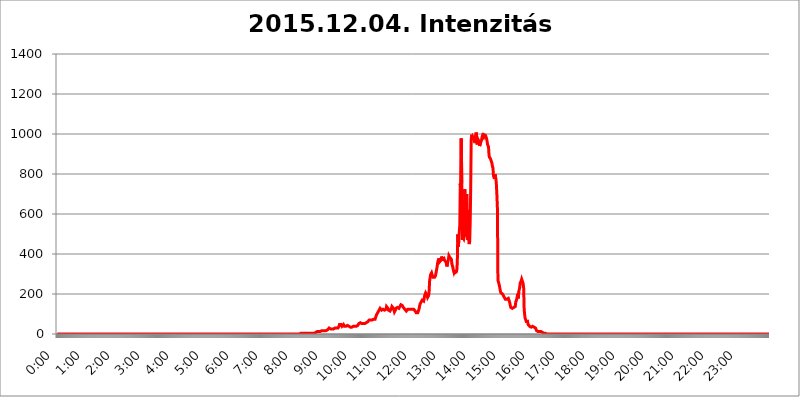
| Category | 2015.12.04. Intenzitás [W/m^2] |
|---|---|
| 0.0 | 0 |
| 0.0006944444444444445 | 0 |
| 0.001388888888888889 | 0 |
| 0.0020833333333333333 | 0 |
| 0.002777777777777778 | 0 |
| 0.003472222222222222 | 0 |
| 0.004166666666666667 | 0 |
| 0.004861111111111111 | 0 |
| 0.005555555555555556 | 0 |
| 0.0062499999999999995 | 0 |
| 0.006944444444444444 | 0 |
| 0.007638888888888889 | 0 |
| 0.008333333333333333 | 0 |
| 0.009027777777777779 | 0 |
| 0.009722222222222222 | 0 |
| 0.010416666666666666 | 0 |
| 0.011111111111111112 | 0 |
| 0.011805555555555555 | 0 |
| 0.012499999999999999 | 0 |
| 0.013194444444444444 | 0 |
| 0.013888888888888888 | 0 |
| 0.014583333333333332 | 0 |
| 0.015277777777777777 | 0 |
| 0.015972222222222224 | 0 |
| 0.016666666666666666 | 0 |
| 0.017361111111111112 | 0 |
| 0.018055555555555557 | 0 |
| 0.01875 | 0 |
| 0.019444444444444445 | 0 |
| 0.02013888888888889 | 0 |
| 0.020833333333333332 | 0 |
| 0.02152777777777778 | 0 |
| 0.022222222222222223 | 0 |
| 0.02291666666666667 | 0 |
| 0.02361111111111111 | 0 |
| 0.024305555555555556 | 0 |
| 0.024999999999999998 | 0 |
| 0.025694444444444447 | 0 |
| 0.02638888888888889 | 0 |
| 0.027083333333333334 | 0 |
| 0.027777777777777776 | 0 |
| 0.02847222222222222 | 0 |
| 0.029166666666666664 | 0 |
| 0.029861111111111113 | 0 |
| 0.030555555555555555 | 0 |
| 0.03125 | 0 |
| 0.03194444444444445 | 0 |
| 0.03263888888888889 | 0 |
| 0.03333333333333333 | 0 |
| 0.034027777777777775 | 0 |
| 0.034722222222222224 | 0 |
| 0.035416666666666666 | 0 |
| 0.036111111111111115 | 0 |
| 0.03680555555555556 | 0 |
| 0.0375 | 0 |
| 0.03819444444444444 | 0 |
| 0.03888888888888889 | 0 |
| 0.03958333333333333 | 0 |
| 0.04027777777777778 | 0 |
| 0.04097222222222222 | 0 |
| 0.041666666666666664 | 0 |
| 0.042361111111111106 | 0 |
| 0.04305555555555556 | 0 |
| 0.043750000000000004 | 0 |
| 0.044444444444444446 | 0 |
| 0.04513888888888889 | 0 |
| 0.04583333333333334 | 0 |
| 0.04652777777777778 | 0 |
| 0.04722222222222222 | 0 |
| 0.04791666666666666 | 0 |
| 0.04861111111111111 | 0 |
| 0.049305555555555554 | 0 |
| 0.049999999999999996 | 0 |
| 0.05069444444444445 | 0 |
| 0.051388888888888894 | 0 |
| 0.052083333333333336 | 0 |
| 0.05277777777777778 | 0 |
| 0.05347222222222222 | 0 |
| 0.05416666666666667 | 0 |
| 0.05486111111111111 | 0 |
| 0.05555555555555555 | 0 |
| 0.05625 | 0 |
| 0.05694444444444444 | 0 |
| 0.057638888888888885 | 0 |
| 0.05833333333333333 | 0 |
| 0.05902777777777778 | 0 |
| 0.059722222222222225 | 0 |
| 0.06041666666666667 | 0 |
| 0.061111111111111116 | 0 |
| 0.06180555555555556 | 0 |
| 0.0625 | 0 |
| 0.06319444444444444 | 0 |
| 0.06388888888888888 | 0 |
| 0.06458333333333334 | 0 |
| 0.06527777777777778 | 0 |
| 0.06597222222222222 | 0 |
| 0.06666666666666667 | 0 |
| 0.06736111111111111 | 0 |
| 0.06805555555555555 | 0 |
| 0.06874999999999999 | 0 |
| 0.06944444444444443 | 0 |
| 0.07013888888888889 | 0 |
| 0.07083333333333333 | 0 |
| 0.07152777777777779 | 0 |
| 0.07222222222222223 | 0 |
| 0.07291666666666667 | 0 |
| 0.07361111111111111 | 0 |
| 0.07430555555555556 | 0 |
| 0.075 | 0 |
| 0.07569444444444444 | 0 |
| 0.0763888888888889 | 0 |
| 0.07708333333333334 | 0 |
| 0.07777777777777778 | 0 |
| 0.07847222222222222 | 0 |
| 0.07916666666666666 | 0 |
| 0.0798611111111111 | 0 |
| 0.08055555555555556 | 0 |
| 0.08125 | 0 |
| 0.08194444444444444 | 0 |
| 0.08263888888888889 | 0 |
| 0.08333333333333333 | 0 |
| 0.08402777777777777 | 0 |
| 0.08472222222222221 | 0 |
| 0.08541666666666665 | 0 |
| 0.08611111111111112 | 0 |
| 0.08680555555555557 | 0 |
| 0.08750000000000001 | 0 |
| 0.08819444444444445 | 0 |
| 0.08888888888888889 | 0 |
| 0.08958333333333333 | 0 |
| 0.09027777777777778 | 0 |
| 0.09097222222222222 | 0 |
| 0.09166666666666667 | 0 |
| 0.09236111111111112 | 0 |
| 0.09305555555555556 | 0 |
| 0.09375 | 0 |
| 0.09444444444444444 | 0 |
| 0.09513888888888888 | 0 |
| 0.09583333333333333 | 0 |
| 0.09652777777777777 | 0 |
| 0.09722222222222222 | 0 |
| 0.09791666666666667 | 0 |
| 0.09861111111111111 | 0 |
| 0.09930555555555555 | 0 |
| 0.09999999999999999 | 0 |
| 0.10069444444444443 | 0 |
| 0.1013888888888889 | 0 |
| 0.10208333333333335 | 0 |
| 0.10277777777777779 | 0 |
| 0.10347222222222223 | 0 |
| 0.10416666666666667 | 0 |
| 0.10486111111111111 | 0 |
| 0.10555555555555556 | 0 |
| 0.10625 | 0 |
| 0.10694444444444444 | 0 |
| 0.1076388888888889 | 0 |
| 0.10833333333333334 | 0 |
| 0.10902777777777778 | 0 |
| 0.10972222222222222 | 0 |
| 0.1111111111111111 | 0 |
| 0.11180555555555556 | 0 |
| 0.11180555555555556 | 0 |
| 0.1125 | 0 |
| 0.11319444444444444 | 0 |
| 0.11388888888888889 | 0 |
| 0.11458333333333333 | 0 |
| 0.11527777777777777 | 0 |
| 0.11597222222222221 | 0 |
| 0.11666666666666665 | 0 |
| 0.1173611111111111 | 0 |
| 0.11805555555555557 | 0 |
| 0.11944444444444445 | 0 |
| 0.12013888888888889 | 0 |
| 0.12083333333333333 | 0 |
| 0.12152777777777778 | 0 |
| 0.12222222222222223 | 0 |
| 0.12291666666666667 | 0 |
| 0.12291666666666667 | 0 |
| 0.12361111111111112 | 0 |
| 0.12430555555555556 | 0 |
| 0.125 | 0 |
| 0.12569444444444444 | 0 |
| 0.12638888888888888 | 0 |
| 0.12708333333333333 | 0 |
| 0.16875 | 0 |
| 0.12847222222222224 | 0 |
| 0.12916666666666668 | 0 |
| 0.12986111111111112 | 0 |
| 0.13055555555555556 | 0 |
| 0.13125 | 0 |
| 0.13194444444444445 | 0 |
| 0.1326388888888889 | 0 |
| 0.13333333333333333 | 0 |
| 0.13402777777777777 | 0 |
| 0.13402777777777777 | 0 |
| 0.13472222222222222 | 0 |
| 0.13541666666666666 | 0 |
| 0.1361111111111111 | 0 |
| 0.13749999999999998 | 0 |
| 0.13819444444444443 | 0 |
| 0.1388888888888889 | 0 |
| 0.13958333333333334 | 0 |
| 0.14027777777777778 | 0 |
| 0.14097222222222222 | 0 |
| 0.14166666666666666 | 0 |
| 0.1423611111111111 | 0 |
| 0.14305555555555557 | 0 |
| 0.14375000000000002 | 0 |
| 0.14444444444444446 | 0 |
| 0.1451388888888889 | 0 |
| 0.1451388888888889 | 0 |
| 0.14652777777777778 | 0 |
| 0.14722222222222223 | 0 |
| 0.14791666666666667 | 0 |
| 0.1486111111111111 | 0 |
| 0.14930555555555555 | 0 |
| 0.15 | 0 |
| 0.15069444444444444 | 0 |
| 0.15138888888888888 | 0 |
| 0.15208333333333332 | 0 |
| 0.15277777777777776 | 0 |
| 0.15347222222222223 | 0 |
| 0.15416666666666667 | 0 |
| 0.15486111111111112 | 0 |
| 0.15555555555555556 | 0 |
| 0.15625 | 0 |
| 0.15694444444444444 | 0 |
| 0.15763888888888888 | 0 |
| 0.15833333333333333 | 0 |
| 0.15902777777777777 | 0 |
| 0.15972222222222224 | 0 |
| 0.16041666666666668 | 0 |
| 0.16111111111111112 | 0 |
| 0.16180555555555556 | 0 |
| 0.1625 | 0 |
| 0.16319444444444445 | 0 |
| 0.1638888888888889 | 0 |
| 0.16458333333333333 | 0 |
| 0.16527777777777777 | 0 |
| 0.16597222222222222 | 0 |
| 0.16666666666666666 | 0 |
| 0.1673611111111111 | 0 |
| 0.16805555555555554 | 0 |
| 0.16874999999999998 | 0 |
| 0.16944444444444443 | 0 |
| 0.17013888888888887 | 0 |
| 0.1708333333333333 | 0 |
| 0.17152777777777775 | 0 |
| 0.17222222222222225 | 0 |
| 0.1729166666666667 | 0 |
| 0.17361111111111113 | 0 |
| 0.17430555555555557 | 0 |
| 0.17500000000000002 | 0 |
| 0.17569444444444446 | 0 |
| 0.1763888888888889 | 0 |
| 0.17708333333333334 | 0 |
| 0.17777777777777778 | 0 |
| 0.17847222222222223 | 0 |
| 0.17916666666666667 | 0 |
| 0.1798611111111111 | 0 |
| 0.18055555555555555 | 0 |
| 0.18125 | 0 |
| 0.18194444444444444 | 0 |
| 0.1826388888888889 | 0 |
| 0.18333333333333335 | 0 |
| 0.1840277777777778 | 0 |
| 0.18472222222222223 | 0 |
| 0.18541666666666667 | 0 |
| 0.18611111111111112 | 0 |
| 0.18680555555555556 | 0 |
| 0.1875 | 0 |
| 0.18819444444444444 | 0 |
| 0.18888888888888888 | 0 |
| 0.18958333333333333 | 0 |
| 0.19027777777777777 | 0 |
| 0.1909722222222222 | 0 |
| 0.19166666666666665 | 0 |
| 0.19236111111111112 | 0 |
| 0.19305555555555554 | 0 |
| 0.19375 | 0 |
| 0.19444444444444445 | 0 |
| 0.1951388888888889 | 0 |
| 0.19583333333333333 | 0 |
| 0.19652777777777777 | 0 |
| 0.19722222222222222 | 0 |
| 0.19791666666666666 | 0 |
| 0.1986111111111111 | 0 |
| 0.19930555555555554 | 0 |
| 0.19999999999999998 | 0 |
| 0.20069444444444443 | 0 |
| 0.20138888888888887 | 0 |
| 0.2020833333333333 | 0 |
| 0.2027777777777778 | 0 |
| 0.2034722222222222 | 0 |
| 0.2041666666666667 | 0 |
| 0.20486111111111113 | 0 |
| 0.20555555555555557 | 0 |
| 0.20625000000000002 | 0 |
| 0.20694444444444446 | 0 |
| 0.2076388888888889 | 0 |
| 0.20833333333333334 | 0 |
| 0.20902777777777778 | 0 |
| 0.20972222222222223 | 0 |
| 0.21041666666666667 | 0 |
| 0.2111111111111111 | 0 |
| 0.21180555555555555 | 0 |
| 0.2125 | 0 |
| 0.21319444444444444 | 0 |
| 0.2138888888888889 | 0 |
| 0.21458333333333335 | 0 |
| 0.2152777777777778 | 0 |
| 0.21597222222222223 | 0 |
| 0.21666666666666667 | 0 |
| 0.21736111111111112 | 0 |
| 0.21805555555555556 | 0 |
| 0.21875 | 0 |
| 0.21944444444444444 | 0 |
| 0.22013888888888888 | 0 |
| 0.22083333333333333 | 0 |
| 0.22152777777777777 | 0 |
| 0.2222222222222222 | 0 |
| 0.22291666666666665 | 0 |
| 0.2236111111111111 | 0 |
| 0.22430555555555556 | 0 |
| 0.225 | 0 |
| 0.22569444444444445 | 0 |
| 0.2263888888888889 | 0 |
| 0.22708333333333333 | 0 |
| 0.22777777777777777 | 0 |
| 0.22847222222222222 | 0 |
| 0.22916666666666666 | 0 |
| 0.2298611111111111 | 0 |
| 0.23055555555555554 | 0 |
| 0.23124999999999998 | 0 |
| 0.23194444444444443 | 0 |
| 0.23263888888888887 | 0 |
| 0.2333333333333333 | 0 |
| 0.2340277777777778 | 0 |
| 0.2347222222222222 | 0 |
| 0.2354166666666667 | 0 |
| 0.23611111111111113 | 0 |
| 0.23680555555555557 | 0 |
| 0.23750000000000002 | 0 |
| 0.23819444444444446 | 0 |
| 0.2388888888888889 | 0 |
| 0.23958333333333334 | 0 |
| 0.24027777777777778 | 0 |
| 0.24097222222222223 | 0 |
| 0.24166666666666667 | 0 |
| 0.2423611111111111 | 0 |
| 0.24305555555555555 | 0 |
| 0.24375 | 0 |
| 0.24444444444444446 | 0 |
| 0.24513888888888888 | 0 |
| 0.24583333333333335 | 0 |
| 0.2465277777777778 | 0 |
| 0.24722222222222223 | 0 |
| 0.24791666666666667 | 0 |
| 0.24861111111111112 | 0 |
| 0.24930555555555556 | 0 |
| 0.25 | 0 |
| 0.25069444444444444 | 0 |
| 0.2513888888888889 | 0 |
| 0.2520833333333333 | 0 |
| 0.25277777777777777 | 0 |
| 0.2534722222222222 | 0 |
| 0.25416666666666665 | 0 |
| 0.2548611111111111 | 0 |
| 0.2555555555555556 | 0 |
| 0.25625000000000003 | 0 |
| 0.2569444444444445 | 0 |
| 0.2576388888888889 | 0 |
| 0.25833333333333336 | 0 |
| 0.2590277777777778 | 0 |
| 0.25972222222222224 | 0 |
| 0.2604166666666667 | 0 |
| 0.2611111111111111 | 0 |
| 0.26180555555555557 | 0 |
| 0.2625 | 0 |
| 0.26319444444444445 | 0 |
| 0.2638888888888889 | 0 |
| 0.26458333333333334 | 0 |
| 0.2652777777777778 | 0 |
| 0.2659722222222222 | 0 |
| 0.26666666666666666 | 0 |
| 0.2673611111111111 | 0 |
| 0.26805555555555555 | 0 |
| 0.26875 | 0 |
| 0.26944444444444443 | 0 |
| 0.2701388888888889 | 0 |
| 0.2708333333333333 | 0 |
| 0.27152777777777776 | 0 |
| 0.2722222222222222 | 0 |
| 0.27291666666666664 | 0 |
| 0.2736111111111111 | 0 |
| 0.2743055555555555 | 0 |
| 0.27499999999999997 | 0 |
| 0.27569444444444446 | 0 |
| 0.27638888888888885 | 0 |
| 0.27708333333333335 | 0 |
| 0.2777777777777778 | 0 |
| 0.27847222222222223 | 0 |
| 0.2791666666666667 | 0 |
| 0.2798611111111111 | 0 |
| 0.28055555555555556 | 0 |
| 0.28125 | 0 |
| 0.28194444444444444 | 0 |
| 0.2826388888888889 | 0 |
| 0.2833333333333333 | 0 |
| 0.28402777777777777 | 0 |
| 0.2847222222222222 | 0 |
| 0.28541666666666665 | 0 |
| 0.28611111111111115 | 0 |
| 0.28680555555555554 | 0 |
| 0.28750000000000003 | 0 |
| 0.2881944444444445 | 0 |
| 0.2888888888888889 | 0 |
| 0.28958333333333336 | 0 |
| 0.2902777777777778 | 0 |
| 0.29097222222222224 | 0 |
| 0.2916666666666667 | 0 |
| 0.2923611111111111 | 0 |
| 0.29305555555555557 | 0 |
| 0.29375 | 0 |
| 0.29444444444444445 | 0 |
| 0.2951388888888889 | 0 |
| 0.29583333333333334 | 0 |
| 0.2965277777777778 | 0 |
| 0.2972222222222222 | 0 |
| 0.29791666666666666 | 0 |
| 0.2986111111111111 | 0 |
| 0.29930555555555555 | 0 |
| 0.3 | 0 |
| 0.30069444444444443 | 0 |
| 0.3013888888888889 | 0 |
| 0.3020833333333333 | 0 |
| 0.30277777777777776 | 0 |
| 0.3034722222222222 | 0 |
| 0.30416666666666664 | 0 |
| 0.3048611111111111 | 0 |
| 0.3055555555555555 | 0 |
| 0.30624999999999997 | 0 |
| 0.3069444444444444 | 0 |
| 0.3076388888888889 | 0 |
| 0.30833333333333335 | 0 |
| 0.3090277777777778 | 0 |
| 0.30972222222222223 | 0 |
| 0.3104166666666667 | 0 |
| 0.3111111111111111 | 0 |
| 0.31180555555555556 | 0 |
| 0.3125 | 0 |
| 0.31319444444444444 | 0 |
| 0.3138888888888889 | 0 |
| 0.3145833333333333 | 0 |
| 0.31527777777777777 | 0 |
| 0.3159722222222222 | 0 |
| 0.31666666666666665 | 0 |
| 0.31736111111111115 | 0 |
| 0.31805555555555554 | 0 |
| 0.31875000000000003 | 0 |
| 0.3194444444444445 | 0 |
| 0.3201388888888889 | 0 |
| 0.32083333333333336 | 0 |
| 0.3215277777777778 | 0 |
| 0.32222222222222224 | 0 |
| 0.3229166666666667 | 0 |
| 0.3236111111111111 | 0 |
| 0.32430555555555557 | 0 |
| 0.325 | 0 |
| 0.32569444444444445 | 0 |
| 0.3263888888888889 | 0 |
| 0.32708333333333334 | 0 |
| 0.3277777777777778 | 0 |
| 0.3284722222222222 | 0 |
| 0.32916666666666666 | 0 |
| 0.3298611111111111 | 0 |
| 0.33055555555555555 | 0 |
| 0.33125 | 0 |
| 0.33194444444444443 | 0 |
| 0.3326388888888889 | 0 |
| 0.3333333333333333 | 0 |
| 0.3340277777777778 | 0 |
| 0.3347222222222222 | 0 |
| 0.3354166666666667 | 0 |
| 0.3361111111111111 | 0 |
| 0.3368055555555556 | 0 |
| 0.33749999999999997 | 0 |
| 0.33819444444444446 | 0 |
| 0.33888888888888885 | 0 |
| 0.33958333333333335 | 0 |
| 0.34027777777777773 | 3.525 |
| 0.34097222222222223 | 3.525 |
| 0.3416666666666666 | 3.525 |
| 0.3423611111111111 | 3.525 |
| 0.3430555555555555 | 3.525 |
| 0.34375 | 3.525 |
| 0.3444444444444445 | 3.525 |
| 0.3451388888888889 | 3.525 |
| 0.3458333333333334 | 3.525 |
| 0.34652777777777777 | 3.525 |
| 0.34722222222222227 | 3.525 |
| 0.34791666666666665 | 3.525 |
| 0.34861111111111115 | 3.525 |
| 0.34930555555555554 | 3.525 |
| 0.35000000000000003 | 3.525 |
| 0.3506944444444444 | 3.525 |
| 0.3513888888888889 | 3.525 |
| 0.3520833333333333 | 3.525 |
| 0.3527777777777778 | 3.525 |
| 0.3534722222222222 | 3.525 |
| 0.3541666666666667 | 3.525 |
| 0.3548611111111111 | 3.525 |
| 0.35555555555555557 | 3.525 |
| 0.35625 | 3.525 |
| 0.35694444444444445 | 3.525 |
| 0.3576388888888889 | 3.525 |
| 0.35833333333333334 | 3.525 |
| 0.3590277777777778 | 3.525 |
| 0.3597222222222222 | 3.525 |
| 0.36041666666666666 | 3.525 |
| 0.3611111111111111 | 3.525 |
| 0.36180555555555555 | 7.887 |
| 0.3625 | 7.887 |
| 0.36319444444444443 | 7.887 |
| 0.3638888888888889 | 12.257 |
| 0.3645833333333333 | 12.257 |
| 0.3652777777777778 | 12.257 |
| 0.3659722222222222 | 12.257 |
| 0.3666666666666667 | 12.257 |
| 0.3673611111111111 | 12.257 |
| 0.3680555555555556 | 12.257 |
| 0.36874999999999997 | 12.257 |
| 0.36944444444444446 | 12.257 |
| 0.37013888888888885 | 12.257 |
| 0.37083333333333335 | 16.636 |
| 0.37152777777777773 | 16.636 |
| 0.37222222222222223 | 16.636 |
| 0.3729166666666666 | 16.636 |
| 0.3736111111111111 | 16.636 |
| 0.3743055555555555 | 16.636 |
| 0.375 | 16.636 |
| 0.3756944444444445 | 16.636 |
| 0.3763888888888889 | 16.636 |
| 0.3770833333333334 | 16.636 |
| 0.37777777777777777 | 16.636 |
| 0.37847222222222227 | 16.636 |
| 0.37916666666666665 | 21.024 |
| 0.37986111111111115 | 21.024 |
| 0.38055555555555554 | 25.419 |
| 0.38125000000000003 | 29.823 |
| 0.3819444444444444 | 29.823 |
| 0.3826388888888889 | 29.823 |
| 0.3833333333333333 | 25.419 |
| 0.3840277777777778 | 25.419 |
| 0.3847222222222222 | 25.419 |
| 0.3854166666666667 | 25.419 |
| 0.3861111111111111 | 25.419 |
| 0.38680555555555557 | 25.419 |
| 0.3875 | 25.419 |
| 0.38819444444444445 | 25.419 |
| 0.3888888888888889 | 29.823 |
| 0.38958333333333334 | 29.823 |
| 0.3902777777777778 | 29.823 |
| 0.3909722222222222 | 29.823 |
| 0.39166666666666666 | 29.823 |
| 0.3923611111111111 | 29.823 |
| 0.39305555555555555 | 29.823 |
| 0.39375 | 29.823 |
| 0.39444444444444443 | 34.234 |
| 0.3951388888888889 | 38.653 |
| 0.3958333333333333 | 47.511 |
| 0.3965277777777778 | 47.511 |
| 0.3972222222222222 | 47.511 |
| 0.3979166666666667 | 47.511 |
| 0.3986111111111111 | 43.079 |
| 0.3993055555555556 | 38.653 |
| 0.39999999999999997 | 43.079 |
| 0.40069444444444446 | 43.079 |
| 0.40138888888888885 | 47.511 |
| 0.40208333333333335 | 43.079 |
| 0.40277777777777773 | 38.653 |
| 0.40347222222222223 | 38.653 |
| 0.4041666666666666 | 34.234 |
| 0.4048611111111111 | 38.653 |
| 0.4055555555555555 | 38.653 |
| 0.40625 | 38.653 |
| 0.4069444444444445 | 43.079 |
| 0.4076388888888889 | 43.079 |
| 0.4083333333333334 | 38.653 |
| 0.40902777777777777 | 38.653 |
| 0.40972222222222227 | 38.653 |
| 0.41041666666666665 | 38.653 |
| 0.41111111111111115 | 34.234 |
| 0.41180555555555554 | 34.234 |
| 0.41250000000000003 | 34.234 |
| 0.4131944444444444 | 34.234 |
| 0.4138888888888889 | 34.234 |
| 0.4145833333333333 | 34.234 |
| 0.4152777777777778 | 38.653 |
| 0.4159722222222222 | 38.653 |
| 0.4166666666666667 | 38.653 |
| 0.4173611111111111 | 38.653 |
| 0.41805555555555557 | 38.653 |
| 0.41875 | 38.653 |
| 0.41944444444444445 | 38.653 |
| 0.4201388888888889 | 38.653 |
| 0.42083333333333334 | 38.653 |
| 0.4215277777777778 | 43.079 |
| 0.4222222222222222 | 47.511 |
| 0.42291666666666666 | 51.951 |
| 0.4236111111111111 | 51.951 |
| 0.42430555555555555 | 51.951 |
| 0.425 | 56.398 |
| 0.42569444444444443 | 56.398 |
| 0.4263888888888889 | 56.398 |
| 0.4270833333333333 | 51.951 |
| 0.4277777777777778 | 51.951 |
| 0.4284722222222222 | 51.951 |
| 0.4291666666666667 | 51.951 |
| 0.4298611111111111 | 51.951 |
| 0.4305555555555556 | 51.951 |
| 0.43124999999999997 | 51.951 |
| 0.43194444444444446 | 51.951 |
| 0.43263888888888885 | 51.951 |
| 0.43333333333333335 | 56.398 |
| 0.43402777777777773 | 56.398 |
| 0.43472222222222223 | 60.85 |
| 0.4354166666666666 | 60.85 |
| 0.4361111111111111 | 65.31 |
| 0.4368055555555555 | 65.31 |
| 0.4375 | 69.775 |
| 0.4381944444444445 | 69.775 |
| 0.4388888888888889 | 69.775 |
| 0.4395833333333334 | 69.775 |
| 0.44027777777777777 | 69.775 |
| 0.44097222222222227 | 69.775 |
| 0.44166666666666665 | 69.775 |
| 0.44236111111111115 | 74.246 |
| 0.44305555555555554 | 74.246 |
| 0.44375000000000003 | 74.246 |
| 0.4444444444444444 | 74.246 |
| 0.4451388888888889 | 74.246 |
| 0.4458333333333333 | 74.246 |
| 0.4465277777777778 | 83.205 |
| 0.4472222222222222 | 87.692 |
| 0.4479166666666667 | 96.682 |
| 0.4486111111111111 | 101.184 |
| 0.44930555555555557 | 105.69 |
| 0.45 | 110.201 |
| 0.45069444444444445 | 110.201 |
| 0.4513888888888889 | 119.235 |
| 0.45208333333333334 | 123.758 |
| 0.4527777777777778 | 128.284 |
| 0.4534722222222222 | 128.284 |
| 0.45416666666666666 | 123.758 |
| 0.4548611111111111 | 119.235 |
| 0.45555555555555555 | 123.758 |
| 0.45625 | 123.758 |
| 0.45694444444444443 | 123.758 |
| 0.4576388888888889 | 119.235 |
| 0.4583333333333333 | 119.235 |
| 0.4590277777777778 | 119.235 |
| 0.4597222222222222 | 119.235 |
| 0.4604166666666667 | 119.235 |
| 0.4611111111111111 | 123.758 |
| 0.4618055555555556 | 137.347 |
| 0.46249999999999997 | 137.347 |
| 0.46319444444444446 | 132.814 |
| 0.46388888888888885 | 128.284 |
| 0.46458333333333335 | 119.235 |
| 0.46527777777777773 | 114.716 |
| 0.46597222222222223 | 114.716 |
| 0.4666666666666666 | 114.716 |
| 0.4673611111111111 | 114.716 |
| 0.4680555555555555 | 119.235 |
| 0.46875 | 128.284 |
| 0.4694444444444445 | 137.347 |
| 0.4701388888888889 | 137.347 |
| 0.4708333333333334 | 137.347 |
| 0.47152777777777777 | 128.284 |
| 0.47222222222222227 | 119.235 |
| 0.47291666666666665 | 110.201 |
| 0.47361111111111115 | 110.201 |
| 0.47430555555555554 | 119.235 |
| 0.47500000000000003 | 128.284 |
| 0.4756944444444444 | 128.284 |
| 0.4763888888888889 | 132.814 |
| 0.4770833333333333 | 132.814 |
| 0.4777777777777778 | 132.814 |
| 0.4784722222222222 | 128.284 |
| 0.4791666666666667 | 128.284 |
| 0.4798611111111111 | 128.284 |
| 0.48055555555555557 | 137.347 |
| 0.48125 | 141.884 |
| 0.48194444444444445 | 146.423 |
| 0.4826388888888889 | 146.423 |
| 0.48333333333333334 | 141.884 |
| 0.4840277777777778 | 141.884 |
| 0.4847222222222222 | 137.347 |
| 0.48541666666666666 | 132.814 |
| 0.4861111111111111 | 128.284 |
| 0.48680555555555555 | 128.284 |
| 0.4875 | 123.758 |
| 0.48819444444444443 | 123.758 |
| 0.4888888888888889 | 119.235 |
| 0.4895833333333333 | 114.716 |
| 0.4902777777777778 | 119.235 |
| 0.4909722222222222 | 119.235 |
| 0.4916666666666667 | 123.758 |
| 0.4923611111111111 | 123.758 |
| 0.4930555555555556 | 123.758 |
| 0.49374999999999997 | 123.758 |
| 0.49444444444444446 | 123.758 |
| 0.49513888888888885 | 123.758 |
| 0.49583333333333335 | 123.758 |
| 0.49652777777777773 | 119.235 |
| 0.49722222222222223 | 119.235 |
| 0.4979166666666666 | 123.758 |
| 0.4986111111111111 | 123.758 |
| 0.4993055555555555 | 123.758 |
| 0.5 | 123.758 |
| 0.5006944444444444 | 119.235 |
| 0.5013888888888889 | 119.235 |
| 0.5020833333333333 | 114.716 |
| 0.5027777777777778 | 110.201 |
| 0.5034722222222222 | 105.69 |
| 0.5041666666666667 | 110.201 |
| 0.5048611111111111 | 105.69 |
| 0.5055555555555555 | 105.69 |
| 0.50625 | 110.201 |
| 0.5069444444444444 | 119.235 |
| 0.5076388888888889 | 128.284 |
| 0.5083333333333333 | 141.884 |
| 0.5090277777777777 | 150.964 |
| 0.5097222222222222 | 155.509 |
| 0.5104166666666666 | 160.056 |
| 0.5111111111111112 | 164.605 |
| 0.5118055555555555 | 169.156 |
| 0.5125000000000001 | 164.605 |
| 0.5131944444444444 | 164.605 |
| 0.513888888888889 | 164.605 |
| 0.5145833333333333 | 178.264 |
| 0.5152777777777778 | 191.937 |
| 0.5159722222222222 | 196.497 |
| 0.5166666666666667 | 205.62 |
| 0.517361111111111 | 205.62 |
| 0.5180555555555556 | 201.058 |
| 0.5187499999999999 | 191.937 |
| 0.5194444444444445 | 182.82 |
| 0.5201388888888888 | 178.264 |
| 0.5208333333333334 | 191.937 |
| 0.5215277777777778 | 210.182 |
| 0.5222222222222223 | 264.932 |
| 0.5229166666666667 | 269.49 |
| 0.5236111111111111 | 296.808 |
| 0.5243055555555556 | 301.354 |
| 0.525 | 305.898 |
| 0.5256944444444445 | 296.808 |
| 0.5263888888888889 | 292.259 |
| 0.5270833333333333 | 283.156 |
| 0.5277777777777778 | 278.603 |
| 0.5284722222222222 | 283.156 |
| 0.5291666666666667 | 283.156 |
| 0.5298611111111111 | 278.603 |
| 0.5305555555555556 | 292.259 |
| 0.53125 | 305.898 |
| 0.5319444444444444 | 310.44 |
| 0.5326388888888889 | 333.113 |
| 0.5333333333333333 | 351.198 |
| 0.5340277777777778 | 364.728 |
| 0.5347222222222222 | 369.23 |
| 0.5354166666666667 | 378.224 |
| 0.5361111111111111 | 360.221 |
| 0.5368055555555555 | 360.221 |
| 0.5375 | 360.221 |
| 0.5381944444444444 | 369.23 |
| 0.5388888888888889 | 387.202 |
| 0.5395833333333333 | 387.202 |
| 0.5402777777777777 | 373.729 |
| 0.5409722222222222 | 373.729 |
| 0.5416666666666666 | 369.23 |
| 0.5423611111111112 | 378.224 |
| 0.5430555555555555 | 369.23 |
| 0.5437500000000001 | 364.728 |
| 0.5444444444444444 | 369.23 |
| 0.545138888888889 | 360.221 |
| 0.5458333333333333 | 351.198 |
| 0.5465277777777778 | 337.639 |
| 0.5472222222222222 | 351.198 |
| 0.5479166666666667 | 351.198 |
| 0.548611111111111 | 373.729 |
| 0.5493055555555556 | 391.685 |
| 0.5499999999999999 | 391.685 |
| 0.5506944444444445 | 382.715 |
| 0.5513888888888888 | 382.715 |
| 0.5520833333333334 | 378.224 |
| 0.5527777777777778 | 373.729 |
| 0.5534722222222223 | 351.198 |
| 0.5541666666666667 | 342.162 |
| 0.5548611111111111 | 333.113 |
| 0.5555555555555556 | 319.517 |
| 0.55625 | 310.44 |
| 0.5569444444444445 | 319.517 |
| 0.5576388888888889 | 305.898 |
| 0.5583333333333333 | 305.898 |
| 0.5590277777777778 | 310.44 |
| 0.5597222222222222 | 310.44 |
| 0.5604166666666667 | 319.517 |
| 0.5611111111111111 | 360.221 |
| 0.5618055555555556 | 497.836 |
| 0.5625 | 436.27 |
| 0.5631944444444444 | 467.187 |
| 0.5638888888888889 | 510.885 |
| 0.5645833333333333 | 545.416 |
| 0.5652777777777778 | 751.803 |
| 0.5659722222222222 | 707.8 |
| 0.5666666666666667 | 977.508 |
| 0.5673611111111111 | 751.803 |
| 0.5680555555555555 | 471.582 |
| 0.56875 | 484.735 |
| 0.5694444444444444 | 484.735 |
| 0.5701388888888889 | 475.972 |
| 0.5708333333333333 | 489.108 |
| 0.5715277777777777 | 723.889 |
| 0.5722222222222222 | 613.252 |
| 0.5729166666666666 | 484.735 |
| 0.5736111111111112 | 667.123 |
| 0.5743055555555555 | 699.717 |
| 0.5750000000000001 | 523.88 |
| 0.5756944444444444 | 471.582 |
| 0.576388888888889 | 617.436 |
| 0.5770833333333333 | 471.582 |
| 0.5777777777777778 | 449.551 |
| 0.5784722222222222 | 462.786 |
| 0.5791666666666667 | 558.261 |
| 0.579861111111111 | 723.889 |
| 0.5805555555555556 | 970.034 |
| 0.5812499999999999 | 996.182 |
| 0.5819444444444445 | 977.508 |
| 0.5826388888888888 | 984.98 |
| 0.5833333333333334 | 984.98 |
| 0.5840277777777778 | 988.714 |
| 0.5847222222222223 | 966.295 |
| 0.5854166666666667 | 962.555 |
| 0.5861111111111111 | 955.071 |
| 0.5868055555555556 | 992.448 |
| 0.5875 | 1007.383 |
| 0.5881944444444445 | 992.448 |
| 0.5888888888888889 | 947.58 |
| 0.5895833333333333 | 977.508 |
| 0.5902777777777778 | 981.244 |
| 0.5909722222222222 | 981.244 |
| 0.5916666666666667 | 962.555 |
| 0.5923611111111111 | 940.082 |
| 0.5930555555555556 | 940.082 |
| 0.59375 | 955.071 |
| 0.5944444444444444 | 962.555 |
| 0.5951388888888889 | 970.034 |
| 0.5958333333333333 | 984.98 |
| 0.5965277777777778 | 992.448 |
| 0.5972222222222222 | 996.182 |
| 0.5979166666666667 | 984.98 |
| 0.5986111111111111 | 996.182 |
| 0.5993055555555555 | 992.448 |
| 0.6 | 992.448 |
| 0.6006944444444444 | 992.448 |
| 0.6013888888888889 | 992.448 |
| 0.6020833333333333 | 977.508 |
| 0.6027777777777777 | 966.295 |
| 0.6034722222222222 | 947.58 |
| 0.6041666666666666 | 947.58 |
| 0.6048611111111112 | 936.33 |
| 0.6055555555555555 | 894.885 |
| 0.6062500000000001 | 883.516 |
| 0.6069444444444444 | 879.719 |
| 0.607638888888889 | 875.918 |
| 0.6083333333333333 | 868.305 |
| 0.6090277777777778 | 872.114 |
| 0.6097222222222222 | 853.029 |
| 0.6104166666666667 | 837.682 |
| 0.611111111111111 | 829.981 |
| 0.6118055555555556 | 791.169 |
| 0.6124999999999999 | 791.169 |
| 0.6131944444444445 | 775.492 |
| 0.6138888888888888 | 798.974 |
| 0.6145833333333334 | 783.342 |
| 0.6152777777777778 | 775.492 |
| 0.6159722222222223 | 743.859 |
| 0.6166666666666667 | 691.608 |
| 0.6173611111111111 | 625.784 |
| 0.6180555555555556 | 269.49 |
| 0.61875 | 260.373 |
| 0.6194444444444445 | 251.251 |
| 0.6201388888888889 | 242.127 |
| 0.6208333333333333 | 228.436 |
| 0.6215277777777778 | 214.746 |
| 0.6222222222222222 | 205.62 |
| 0.6229166666666667 | 201.058 |
| 0.6236111111111111 | 201.058 |
| 0.6243055555555556 | 201.058 |
| 0.625 | 201.058 |
| 0.6256944444444444 | 191.937 |
| 0.6263888888888889 | 187.378 |
| 0.6270833333333333 | 182.82 |
| 0.6277777777777778 | 182.82 |
| 0.6284722222222222 | 173.709 |
| 0.6291666666666667 | 173.709 |
| 0.6298611111111111 | 173.709 |
| 0.6305555555555555 | 173.709 |
| 0.63125 | 173.709 |
| 0.6319444444444444 | 178.264 |
| 0.6326388888888889 | 178.264 |
| 0.6333333333333333 | 173.709 |
| 0.6340277777777777 | 164.605 |
| 0.6347222222222222 | 155.509 |
| 0.6354166666666666 | 141.884 |
| 0.6361111111111112 | 132.814 |
| 0.6368055555555555 | 132.814 |
| 0.6375000000000001 | 132.814 |
| 0.6381944444444444 | 128.284 |
| 0.638888888888889 | 128.284 |
| 0.6395833333333333 | 128.284 |
| 0.6402777777777778 | 132.814 |
| 0.6409722222222222 | 137.347 |
| 0.6416666666666667 | 137.347 |
| 0.642361111111111 | 137.347 |
| 0.6430555555555556 | 160.056 |
| 0.6437499999999999 | 164.605 |
| 0.6444444444444445 | 173.709 |
| 0.6451388888888888 | 178.264 |
| 0.6458333333333334 | 201.058 |
| 0.6465277777777778 | 178.264 |
| 0.6472222222222223 | 210.182 |
| 0.6479166666666667 | 214.746 |
| 0.6486111111111111 | 233 |
| 0.6493055555555556 | 255.813 |
| 0.65 | 260.373 |
| 0.6506944444444445 | 264.932 |
| 0.6513888888888889 | 274.047 |
| 0.6520833333333333 | 274.047 |
| 0.6527777777777778 | 278.603 |
| 0.6534722222222222 | 251.251 |
| 0.6541666666666667 | 228.436 |
| 0.6548611111111111 | 123.758 |
| 0.6555555555555556 | 96.682 |
| 0.65625 | 78.722 |
| 0.6569444444444444 | 74.246 |
| 0.6576388888888889 | 65.31 |
| 0.6583333333333333 | 56.398 |
| 0.6590277777777778 | 69.775 |
| 0.6597222222222222 | 60.85 |
| 0.6604166666666667 | 47.511 |
| 0.6611111111111111 | 43.079 |
| 0.6618055555555555 | 47.511 |
| 0.6625 | 38.653 |
| 0.6631944444444444 | 38.653 |
| 0.6638888888888889 | 34.234 |
| 0.6645833333333333 | 34.234 |
| 0.6652777777777777 | 34.234 |
| 0.6659722222222222 | 38.653 |
| 0.6666666666666666 | 38.653 |
| 0.6673611111111111 | 38.653 |
| 0.6680555555555556 | 34.234 |
| 0.6687500000000001 | 34.234 |
| 0.6694444444444444 | 34.234 |
| 0.6701388888888888 | 29.823 |
| 0.6708333333333334 | 29.823 |
| 0.6715277777777778 | 25.419 |
| 0.6722222222222222 | 16.636 |
| 0.6729166666666666 | 16.636 |
| 0.6736111111111112 | 16.636 |
| 0.6743055555555556 | 12.257 |
| 0.6749999999999999 | 12.257 |
| 0.6756944444444444 | 12.257 |
| 0.6763888888888889 | 12.257 |
| 0.6770833333333334 | 12.257 |
| 0.6777777777777777 | 7.887 |
| 0.6784722222222223 | 12.257 |
| 0.6791666666666667 | 7.887 |
| 0.6798611111111111 | 7.887 |
| 0.6805555555555555 | 7.887 |
| 0.68125 | 7.887 |
| 0.6819444444444445 | 3.525 |
| 0.6826388888888889 | 3.525 |
| 0.6833333333333332 | 3.525 |
| 0.6840277777777778 | 3.525 |
| 0.6847222222222222 | 3.525 |
| 0.6854166666666667 | 3.525 |
| 0.686111111111111 | 3.525 |
| 0.6868055555555556 | 0 |
| 0.6875 | 0 |
| 0.6881944444444444 | 0 |
| 0.688888888888889 | 0 |
| 0.6895833333333333 | 0 |
| 0.6902777777777778 | 0 |
| 0.6909722222222222 | 0 |
| 0.6916666666666668 | 0 |
| 0.6923611111111111 | 0 |
| 0.6930555555555555 | 0 |
| 0.69375 | 0 |
| 0.6944444444444445 | 0 |
| 0.6951388888888889 | 0 |
| 0.6958333333333333 | 0 |
| 0.6965277777777777 | 0 |
| 0.6972222222222223 | 0 |
| 0.6979166666666666 | 0 |
| 0.6986111111111111 | 0 |
| 0.6993055555555556 | 0 |
| 0.7000000000000001 | 0 |
| 0.7006944444444444 | 0 |
| 0.7013888888888888 | 0 |
| 0.7020833333333334 | 0 |
| 0.7027777777777778 | 0 |
| 0.7034722222222222 | 0 |
| 0.7041666666666666 | 0 |
| 0.7048611111111112 | 0 |
| 0.7055555555555556 | 0 |
| 0.7062499999999999 | 0 |
| 0.7069444444444444 | 0 |
| 0.7076388888888889 | 0 |
| 0.7083333333333334 | 0 |
| 0.7090277777777777 | 0 |
| 0.7097222222222223 | 0 |
| 0.7104166666666667 | 0 |
| 0.7111111111111111 | 0 |
| 0.7118055555555555 | 0 |
| 0.7125 | 0 |
| 0.7131944444444445 | 0 |
| 0.7138888888888889 | 0 |
| 0.7145833333333332 | 0 |
| 0.7152777777777778 | 0 |
| 0.7159722222222222 | 0 |
| 0.7166666666666667 | 0 |
| 0.717361111111111 | 0 |
| 0.7180555555555556 | 0 |
| 0.71875 | 0 |
| 0.7194444444444444 | 0 |
| 0.720138888888889 | 0 |
| 0.7208333333333333 | 0 |
| 0.7215277777777778 | 0 |
| 0.7222222222222222 | 0 |
| 0.7229166666666668 | 0 |
| 0.7236111111111111 | 0 |
| 0.7243055555555555 | 0 |
| 0.725 | 0 |
| 0.7256944444444445 | 0 |
| 0.7263888888888889 | 0 |
| 0.7270833333333333 | 0 |
| 0.7277777777777777 | 0 |
| 0.7284722222222223 | 0 |
| 0.7291666666666666 | 0 |
| 0.7298611111111111 | 0 |
| 0.7305555555555556 | 0 |
| 0.7312500000000001 | 0 |
| 0.7319444444444444 | 0 |
| 0.7326388888888888 | 0 |
| 0.7333333333333334 | 0 |
| 0.7340277777777778 | 0 |
| 0.7347222222222222 | 0 |
| 0.7354166666666666 | 0 |
| 0.7361111111111112 | 0 |
| 0.7368055555555556 | 0 |
| 0.7374999999999999 | 0 |
| 0.7381944444444444 | 0 |
| 0.7388888888888889 | 0 |
| 0.7395833333333334 | 0 |
| 0.7402777777777777 | 0 |
| 0.7409722222222223 | 0 |
| 0.7416666666666667 | 0 |
| 0.7423611111111111 | 0 |
| 0.7430555555555555 | 0 |
| 0.74375 | 0 |
| 0.7444444444444445 | 0 |
| 0.7451388888888889 | 0 |
| 0.7458333333333332 | 0 |
| 0.7465277777777778 | 0 |
| 0.7472222222222222 | 0 |
| 0.7479166666666667 | 0 |
| 0.748611111111111 | 0 |
| 0.7493055555555556 | 0 |
| 0.75 | 0 |
| 0.7506944444444444 | 0 |
| 0.751388888888889 | 0 |
| 0.7520833333333333 | 0 |
| 0.7527777777777778 | 0 |
| 0.7534722222222222 | 0 |
| 0.7541666666666668 | 0 |
| 0.7548611111111111 | 0 |
| 0.7555555555555555 | 0 |
| 0.75625 | 0 |
| 0.7569444444444445 | 0 |
| 0.7576388888888889 | 0 |
| 0.7583333333333333 | 0 |
| 0.7590277777777777 | 0 |
| 0.7597222222222223 | 0 |
| 0.7604166666666666 | 0 |
| 0.7611111111111111 | 0 |
| 0.7618055555555556 | 0 |
| 0.7625000000000001 | 0 |
| 0.7631944444444444 | 0 |
| 0.7638888888888888 | 0 |
| 0.7645833333333334 | 0 |
| 0.7652777777777778 | 0 |
| 0.7659722222222222 | 0 |
| 0.7666666666666666 | 0 |
| 0.7673611111111112 | 0 |
| 0.7680555555555556 | 0 |
| 0.7687499999999999 | 0 |
| 0.7694444444444444 | 0 |
| 0.7701388888888889 | 0 |
| 0.7708333333333334 | 0 |
| 0.7715277777777777 | 0 |
| 0.7722222222222223 | 0 |
| 0.7729166666666667 | 0 |
| 0.7736111111111111 | 0 |
| 0.7743055555555555 | 0 |
| 0.775 | 0 |
| 0.7756944444444445 | 0 |
| 0.7763888888888889 | 0 |
| 0.7770833333333332 | 0 |
| 0.7777777777777778 | 0 |
| 0.7784722222222222 | 0 |
| 0.7791666666666667 | 0 |
| 0.779861111111111 | 0 |
| 0.7805555555555556 | 0 |
| 0.78125 | 0 |
| 0.7819444444444444 | 0 |
| 0.782638888888889 | 0 |
| 0.7833333333333333 | 0 |
| 0.7840277777777778 | 0 |
| 0.7847222222222222 | 0 |
| 0.7854166666666668 | 0 |
| 0.7861111111111111 | 0 |
| 0.7868055555555555 | 0 |
| 0.7875 | 0 |
| 0.7881944444444445 | 0 |
| 0.7888888888888889 | 0 |
| 0.7895833333333333 | 0 |
| 0.7902777777777777 | 0 |
| 0.7909722222222223 | 0 |
| 0.7916666666666666 | 0 |
| 0.7923611111111111 | 0 |
| 0.7930555555555556 | 0 |
| 0.7937500000000001 | 0 |
| 0.7944444444444444 | 0 |
| 0.7951388888888888 | 0 |
| 0.7958333333333334 | 0 |
| 0.7965277777777778 | 0 |
| 0.7972222222222222 | 0 |
| 0.7979166666666666 | 0 |
| 0.7986111111111112 | 0 |
| 0.7993055555555556 | 0 |
| 0.7999999999999999 | 0 |
| 0.8006944444444444 | 0 |
| 0.8013888888888889 | 0 |
| 0.8020833333333334 | 0 |
| 0.8027777777777777 | 0 |
| 0.8034722222222223 | 0 |
| 0.8041666666666667 | 0 |
| 0.8048611111111111 | 0 |
| 0.8055555555555555 | 0 |
| 0.80625 | 0 |
| 0.8069444444444445 | 0 |
| 0.8076388888888889 | 0 |
| 0.8083333333333332 | 0 |
| 0.8090277777777778 | 0 |
| 0.8097222222222222 | 0 |
| 0.8104166666666667 | 0 |
| 0.811111111111111 | 0 |
| 0.8118055555555556 | 0 |
| 0.8125 | 0 |
| 0.8131944444444444 | 0 |
| 0.813888888888889 | 0 |
| 0.8145833333333333 | 0 |
| 0.8152777777777778 | 0 |
| 0.8159722222222222 | 0 |
| 0.8166666666666668 | 0 |
| 0.8173611111111111 | 0 |
| 0.8180555555555555 | 0 |
| 0.81875 | 0 |
| 0.8194444444444445 | 0 |
| 0.8201388888888889 | 0 |
| 0.8208333333333333 | 0 |
| 0.8215277777777777 | 0 |
| 0.8222222222222223 | 0 |
| 0.8229166666666666 | 0 |
| 0.8236111111111111 | 0 |
| 0.8243055555555556 | 0 |
| 0.8250000000000001 | 0 |
| 0.8256944444444444 | 0 |
| 0.8263888888888888 | 0 |
| 0.8270833333333334 | 0 |
| 0.8277777777777778 | 0 |
| 0.8284722222222222 | 0 |
| 0.8291666666666666 | 0 |
| 0.8298611111111112 | 0 |
| 0.8305555555555556 | 0 |
| 0.8312499999999999 | 0 |
| 0.8319444444444444 | 0 |
| 0.8326388888888889 | 0 |
| 0.8333333333333334 | 0 |
| 0.8340277777777777 | 0 |
| 0.8347222222222223 | 0 |
| 0.8354166666666667 | 0 |
| 0.8361111111111111 | 0 |
| 0.8368055555555555 | 0 |
| 0.8375 | 0 |
| 0.8381944444444445 | 0 |
| 0.8388888888888889 | 0 |
| 0.8395833333333332 | 0 |
| 0.8402777777777778 | 0 |
| 0.8409722222222222 | 0 |
| 0.8416666666666667 | 0 |
| 0.842361111111111 | 0 |
| 0.8430555555555556 | 0 |
| 0.84375 | 0 |
| 0.8444444444444444 | 0 |
| 0.845138888888889 | 0 |
| 0.8458333333333333 | 0 |
| 0.8465277777777778 | 0 |
| 0.8472222222222222 | 0 |
| 0.8479166666666668 | 0 |
| 0.8486111111111111 | 0 |
| 0.8493055555555555 | 0 |
| 0.85 | 0 |
| 0.8506944444444445 | 0 |
| 0.8513888888888889 | 0 |
| 0.8520833333333333 | 0 |
| 0.8527777777777777 | 0 |
| 0.8534722222222223 | 0 |
| 0.8541666666666666 | 0 |
| 0.8548611111111111 | 0 |
| 0.8555555555555556 | 0 |
| 0.8562500000000001 | 0 |
| 0.8569444444444444 | 0 |
| 0.8576388888888888 | 0 |
| 0.8583333333333334 | 0 |
| 0.8590277777777778 | 0 |
| 0.8597222222222222 | 0 |
| 0.8604166666666666 | 0 |
| 0.8611111111111112 | 0 |
| 0.8618055555555556 | 0 |
| 0.8624999999999999 | 0 |
| 0.8631944444444444 | 0 |
| 0.8638888888888889 | 0 |
| 0.8645833333333334 | 0 |
| 0.8652777777777777 | 0 |
| 0.8659722222222223 | 0 |
| 0.8666666666666667 | 0 |
| 0.8673611111111111 | 0 |
| 0.8680555555555555 | 0 |
| 0.86875 | 0 |
| 0.8694444444444445 | 0 |
| 0.8701388888888889 | 0 |
| 0.8708333333333332 | 0 |
| 0.8715277777777778 | 0 |
| 0.8722222222222222 | 0 |
| 0.8729166666666667 | 0 |
| 0.873611111111111 | 0 |
| 0.8743055555555556 | 0 |
| 0.875 | 0 |
| 0.8756944444444444 | 0 |
| 0.876388888888889 | 0 |
| 0.8770833333333333 | 0 |
| 0.8777777777777778 | 0 |
| 0.8784722222222222 | 0 |
| 0.8791666666666668 | 0 |
| 0.8798611111111111 | 0 |
| 0.8805555555555555 | 0 |
| 0.88125 | 0 |
| 0.8819444444444445 | 0 |
| 0.8826388888888889 | 0 |
| 0.8833333333333333 | 0 |
| 0.8840277777777777 | 0 |
| 0.8847222222222223 | 0 |
| 0.8854166666666666 | 0 |
| 0.8861111111111111 | 0 |
| 0.8868055555555556 | 0 |
| 0.8875000000000001 | 0 |
| 0.8881944444444444 | 0 |
| 0.8888888888888888 | 0 |
| 0.8895833333333334 | 0 |
| 0.8902777777777778 | 0 |
| 0.8909722222222222 | 0 |
| 0.8916666666666666 | 0 |
| 0.8923611111111112 | 0 |
| 0.8930555555555556 | 0 |
| 0.8937499999999999 | 0 |
| 0.8944444444444444 | 0 |
| 0.8951388888888889 | 0 |
| 0.8958333333333334 | 0 |
| 0.8965277777777777 | 0 |
| 0.8972222222222223 | 0 |
| 0.8979166666666667 | 0 |
| 0.8986111111111111 | 0 |
| 0.8993055555555555 | 0 |
| 0.9 | 0 |
| 0.9006944444444445 | 0 |
| 0.9013888888888889 | 0 |
| 0.9020833333333332 | 0 |
| 0.9027777777777778 | 0 |
| 0.9034722222222222 | 0 |
| 0.9041666666666667 | 0 |
| 0.904861111111111 | 0 |
| 0.9055555555555556 | 0 |
| 0.90625 | 0 |
| 0.9069444444444444 | 0 |
| 0.907638888888889 | 0 |
| 0.9083333333333333 | 0 |
| 0.9090277777777778 | 0 |
| 0.9097222222222222 | 0 |
| 0.9104166666666668 | 0 |
| 0.9111111111111111 | 0 |
| 0.9118055555555555 | 0 |
| 0.9125 | 0 |
| 0.9131944444444445 | 0 |
| 0.9138888888888889 | 0 |
| 0.9145833333333333 | 0 |
| 0.9152777777777777 | 0 |
| 0.9159722222222223 | 0 |
| 0.9166666666666666 | 0 |
| 0.9173611111111111 | 0 |
| 0.9180555555555556 | 0 |
| 0.9187500000000001 | 0 |
| 0.9194444444444444 | 0 |
| 0.9201388888888888 | 0 |
| 0.9208333333333334 | 0 |
| 0.9215277777777778 | 0 |
| 0.9222222222222222 | 0 |
| 0.9229166666666666 | 0 |
| 0.9236111111111112 | 0 |
| 0.9243055555555556 | 0 |
| 0.9249999999999999 | 0 |
| 0.9256944444444444 | 0 |
| 0.9263888888888889 | 0 |
| 0.9270833333333334 | 0 |
| 0.9277777777777777 | 0 |
| 0.9284722222222223 | 0 |
| 0.9291666666666667 | 0 |
| 0.9298611111111111 | 0 |
| 0.9305555555555555 | 0 |
| 0.93125 | 0 |
| 0.9319444444444445 | 0 |
| 0.9326388888888889 | 0 |
| 0.9333333333333332 | 0 |
| 0.9340277777777778 | 0 |
| 0.9347222222222222 | 0 |
| 0.9354166666666667 | 0 |
| 0.936111111111111 | 0 |
| 0.9368055555555556 | 0 |
| 0.9375 | 0 |
| 0.9381944444444444 | 0 |
| 0.938888888888889 | 0 |
| 0.9395833333333333 | 0 |
| 0.9402777777777778 | 0 |
| 0.9409722222222222 | 0 |
| 0.9416666666666668 | 0 |
| 0.9423611111111111 | 0 |
| 0.9430555555555555 | 0 |
| 0.94375 | 0 |
| 0.9444444444444445 | 0 |
| 0.9451388888888889 | 0 |
| 0.9458333333333333 | 0 |
| 0.9465277777777777 | 0 |
| 0.9472222222222223 | 0 |
| 0.9479166666666666 | 0 |
| 0.9486111111111111 | 0 |
| 0.9493055555555556 | 0 |
| 0.9500000000000001 | 0 |
| 0.9506944444444444 | 0 |
| 0.9513888888888888 | 0 |
| 0.9520833333333334 | 0 |
| 0.9527777777777778 | 0 |
| 0.9534722222222222 | 0 |
| 0.9541666666666666 | 0 |
| 0.9548611111111112 | 0 |
| 0.9555555555555556 | 0 |
| 0.9562499999999999 | 0 |
| 0.9569444444444444 | 0 |
| 0.9576388888888889 | 0 |
| 0.9583333333333334 | 0 |
| 0.9590277777777777 | 0 |
| 0.9597222222222223 | 0 |
| 0.9604166666666667 | 0 |
| 0.9611111111111111 | 0 |
| 0.9618055555555555 | 0 |
| 0.9625 | 0 |
| 0.9631944444444445 | 0 |
| 0.9638888888888889 | 0 |
| 0.9645833333333332 | 0 |
| 0.9652777777777778 | 0 |
| 0.9659722222222222 | 0 |
| 0.9666666666666667 | 0 |
| 0.967361111111111 | 0 |
| 0.9680555555555556 | 0 |
| 0.96875 | 0 |
| 0.9694444444444444 | 0 |
| 0.970138888888889 | 0 |
| 0.9708333333333333 | 0 |
| 0.9715277777777778 | 0 |
| 0.9722222222222222 | 0 |
| 0.9729166666666668 | 0 |
| 0.9736111111111111 | 0 |
| 0.9743055555555555 | 0 |
| 0.975 | 0 |
| 0.9756944444444445 | 0 |
| 0.9763888888888889 | 0 |
| 0.9770833333333333 | 0 |
| 0.9777777777777777 | 0 |
| 0.9784722222222223 | 0 |
| 0.9791666666666666 | 0 |
| 0.9798611111111111 | 0 |
| 0.9805555555555556 | 0 |
| 0.9812500000000001 | 0 |
| 0.9819444444444444 | 0 |
| 0.9826388888888888 | 0 |
| 0.9833333333333334 | 0 |
| 0.9840277777777778 | 0 |
| 0.9847222222222222 | 0 |
| 0.9854166666666666 | 0 |
| 0.9861111111111112 | 0 |
| 0.9868055555555556 | 0 |
| 0.9874999999999999 | 0 |
| 0.9881944444444444 | 0 |
| 0.9888888888888889 | 0 |
| 0.9895833333333334 | 0 |
| 0.9902777777777777 | 0 |
| 0.9909722222222223 | 0 |
| 0.9916666666666667 | 0 |
| 0.9923611111111111 | 0 |
| 0.9930555555555555 | 0 |
| 0.99375 | 0 |
| 0.9944444444444445 | 0 |
| 0.9951388888888889 | 0 |
| 0.9958333333333332 | 0 |
| 0.9965277777777778 | 0 |
| 0.9972222222222222 | 0 |
| 0.9979166666666667 | 0 |
| 0.998611111111111 | 0 |
| 0.9993055555555556 | 0 |